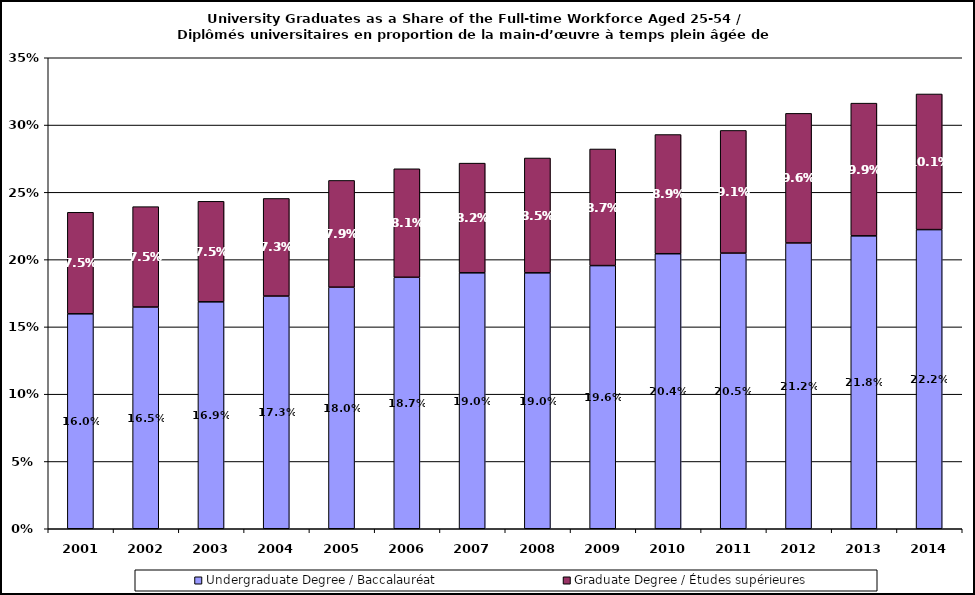
| Category | Undergraduate Degree / Baccalauréat | Graduate Degree / Études supérieures |
|---|---|---|
| 2001.0 | 0.16 | 0.075 |
| 2002.0 | 0.165 | 0.075 |
| 2003.0 | 0.169 | 0.075 |
| 2004.0 | 0.173 | 0.073 |
| 2005.0 | 0.18 | 0.079 |
| 2006.0 | 0.187 | 0.081 |
| 2007.0 | 0.19 | 0.082 |
| 2008.0 | 0.19 | 0.085 |
| 2009.0 | 0.196 | 0.087 |
| 2010.0 | 0.204 | 0.089 |
| 2011.0 | 0.205 | 0.091 |
| 2012.0 | 0.212 | 0.096 |
| 2013.0 | 0.218 | 0.099 |
| 2014.0 | 0.222 | 0.101 |